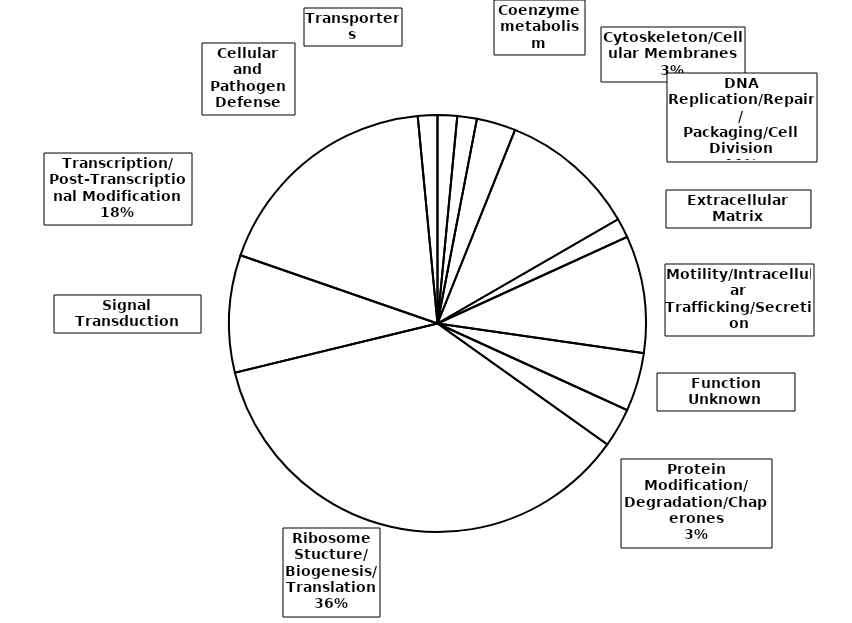
| Category | Series 0 |
|---|---|
| Cellular and Pathogen
Defense | 1 |
| Coenzyme metabolism | 1 |
| Cytoskeleton/Cellular Membranes | 2 |
| DNA Replication/Repair/
Packaging/Cell Division | 7 |
| Extracellular Matrix | 1 |
| Motility/Intracellular Trafficking/Secretion | 6 |
| Function Unknown | 3 |
| Protein Modification/
Degradation/Chaperones | 2 |
| Ribosome Stucture/
Biogenesis/
Translation | 24 |
| Signal Transduction | 6 |
| Transcription/
Post-Transcriptional Modification | 12 |
| Transporters | 1 |